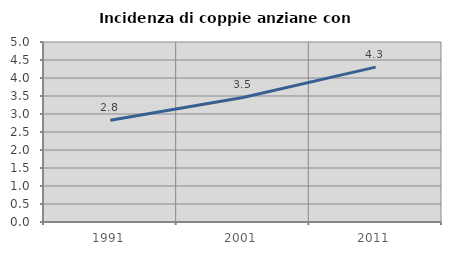
| Category | Incidenza di coppie anziane con figli |
|---|---|
| 1991.0 | 2.827 |
| 2001.0 | 3.46 |
| 2011.0 | 4.301 |